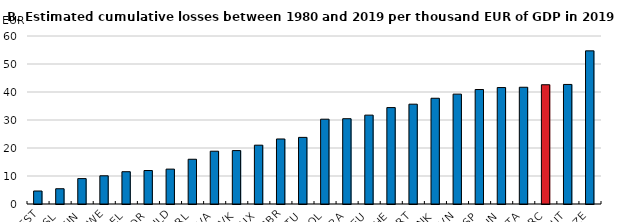
| Category | Loss per unit of GDP, million EUR |
|---|---|
| EST | 4.64 |
| ISL | 5.449 |
| FIN | 9.07 |
| SWE | 10.078 |
| BEL | 11.531 |
| NOR | 11.956 |
| NLD | 12.459 |
| IRL | 15.979 |
| LVA | 18.853 |
| SVK | 19.077 |
| LUX | 21.008 |
| GBR | 23.225 |
| LTU | 23.79 |
| POL | 30.288 |
| FRA | 30.458 |
| DEU | 31.74 |
| CHE | 34.435 |
| PRT | 35.651 |
| DNK | 37.768 |
| SVN | 39.236 |
| ESP | 40.883 |
| HUN | 41.588 |
| ITA | 41.692 |
| GRC | 42.594 |
| AUT | 42.698 |
| CZE | 54.697 |